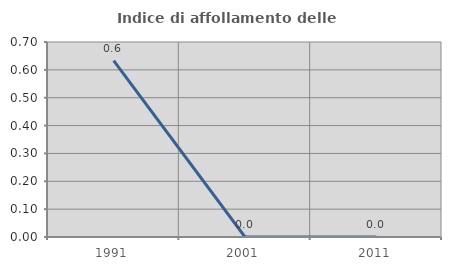
| Category | Indice di affollamento delle abitazioni  |
|---|---|
| 1991.0 | 0.633 |
| 2001.0 | 0 |
| 2011.0 | 0 |